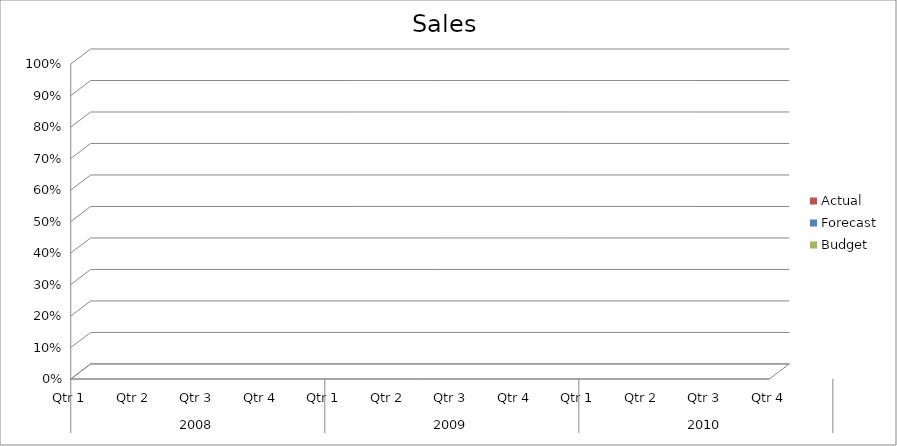
| Category | Budget | Forecast | Actual |
|---|---|---|---|
| 0 | 1590 | 2330 | 1450 |
| 1 | 700 | 2520 | 740 |
| 2 | 2130 | 2030 | 840 |
| 3 | 3420 | 1900 | 3110 |
| 4 | 2370 | 2620 | 1900 |
| 5 | 1930 | 950 | 1110 |
| 6 | 1310 | 3340 | 2630 |
| 7 | 1810 | 2680 | 700 |
| 8 | 3040 | 1210 | 2120 |
| 9 | 1650 | 1470 | 1860 |
| 10 | 3060 | 2620 | 1690 |
| 11 | 1400 | 1130 | 850 |